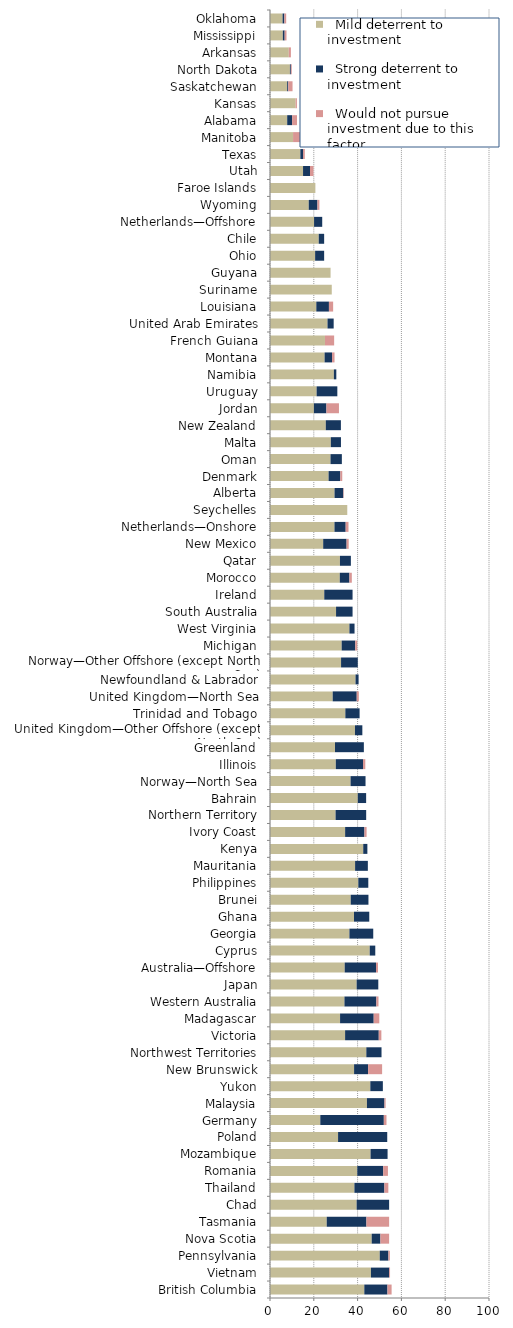
| Category |   Mild deterrent to investment |   Strong deterrent to investment |   Would not pursue investment due to this factor |
|---|---|---|---|
| British Columbia | 43.063 | 10.577 | 1.889 |
| Vietnam | 46.091 | 8.305 | 0.415 |
| Pennsylvania | 50.11 | 3.956 | 0.659 |
| Nova Scotia | 46.435 | 3.98 | 3.98 |
| Tasmania | 25.903 | 18.132 | 10.361 |
| Chad | 39.56 | 14.835 | 0 |
| Thailand | 38.545 | 13.689 | 1.801 |
| Romania | 39.854 | 11.849 | 2.154 |
| Mozambique | 45.918 | 7.771 | 0 |
| Poland | 31.083 | 22.449 | 0 |
| Germany | 22.967 | 29.011 | 1.209 |
| Malaysia | 44.263 | 7.999 | 0.533 |
| Yukon | 45.807 | 5.726 | 0 |
| New Brunswick | 38.397 | 6.399 | 6.399 |
| Northwest Territories | 43.979 | 6.944 | 0 |
| Victoria | 34.293 | 15.373 | 1.183 |
| Madagascar | 31.997 | 15.359 | 2.56 |
| Western Australia | 33.997 | 14.57 | 0.971 |
| Japan | 39.56 | 9.89 | 0 |
| Australia—Offshore | 34.112 | 14.29 | 0.922 |
| Cyprus | 45.541 | 2.53 | 0 |
| Georgia | 36.264 | 10.879 | 0 |
| Ghana | 38.356 | 6.974 | 0 |
| Brunei | 36.863 | 8.092 | 0 |
| Philippines | 40.321 | 4.565 | 0 |
| Mauritania | 38.854 | 5.828 | 0 |
| Kenya | 42.57 | 1.892 | 0 |
| Ivory Coast | 34.304 | 8.821 | 0.98 |
| Northern Territory | 29.943 | 13.973 | 0 |
| Bahrain | 40.081 | 3.817 | 0 |
| Norway—North Sea | 36.789 | 6.832 | 0 |
| Illinois | 30.047 | 12.433 | 1.036 |
| Greenland | 29.67 | 13.187 | 0 |
| United Kingdom—Other Offshore (except North Sea) | 38.794 | 3.373 | 0 |
| Trinidad and Tobago | 34.404 | 6.509 | 0 |
| United Kingdom—North Sea | 28.629 | 10.975 | 0.954 |
| Newfoundland & Labrador | 39.053 | 1.395 | 0 |
| Norway—Other Offshore (except North Sea) | 32.447 | 7.634 | 0 |
| Michigan | 32.726 | 6.191 | 0.884 |
| West Virginia | 36.264 | 2.34 | 0 |
| South Australia | 30.16 | 7.54 | 0 |
| Ireland | 24.774 | 12.926 | 0 |
| Morocco | 31.868 | 4.396 | 1.099 |
| Qatar | 31.939 | 4.99 | 0 |
| New Mexico | 24.284 | 10.685 | 0.971 |
| Netherlands—Onshore | 29.438 | 5.12 | 1.28 |
| Seychelles | 35.284 | 0 | 0 |
| Alberta | 29.469 | 3.988 | 0.222 |
| Denmark | 26.752 | 5.35 | 0.892 |
| Oman | 27.63 | 5.181 | 0 |
| Malta | 27.776 | 4.629 | 0 |
| New Zealand | 25.473 | 6.899 | 0 |
| Jordan | 20.04 | 5.726 | 5.726 |
| Uruguay | 21.285 | 9.46 | 0 |
| Namibia | 29.161 | 1.122 | 0 |
| Montana | 24.931 | 3.4 | 1.133 |
| French Guiana | 25.106 | 0 | 4.184 |
| United Arab Emirates | 26.26 | 2.814 | 0 |
| Louisiana | 21.143 | 5.766 | 1.922 |
| Suriname | 28.205 | 0 | 0 |
| Guyana | 27.659 | 0 | 0 |
| Ohio | 20.604 | 4.121 | 0 |
| Chile | 22.253 | 2.473 | 0 |
| Netherlands—Offshore | 20.119 | 3.726 | 0 |
| Wyoming | 17.69 | 3.98 | 0.884 |
| Faroe Islands | 20.722 | 0 | 0 |
| Utah | 15.088 | 3.176 | 1.588 |
| Texas | 13.854 | 1.222 | 0.815 |
| Manitoba | 10.528 | 0 | 5.264 |
| Alabama | 7.851 | 2.243 | 2.243 |
| Kansas | 11.698 | 0 | 0.585 |
| Saskatchewan | 7.841 | 0.49 | 1.96 |
| North Dakota | 9.1 | 0.414 | 0.414 |
| Arkansas | 8.589 | 0 | 0.954 |
| Mississippi | 5.858 | 0.837 | 0.837 |
| Oklahoma | 5.747 | 0.821 | 0.821 |